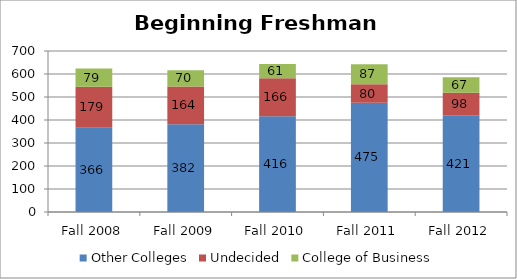
| Category | Other Colleges | Undecided | College of Business |
|---|---|---|---|
| Fall 2008 | 366 | 179 | 79 |
| Fall 2009 | 382 | 164 | 70 |
| Fall 2010 | 416 | 166 | 61 |
| Fall 2011 | 475 | 80 | 87 |
| Fall 2012 | 421 | 98 | 67 |